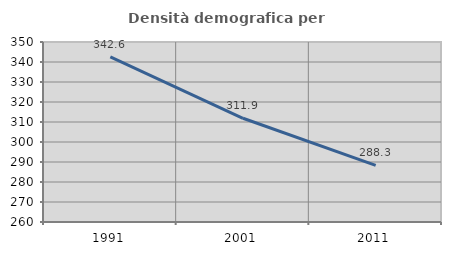
| Category | Densità demografica |
|---|---|
| 1991.0 | 342.571 |
| 2001.0 | 311.857 |
| 2011.0 | 288.319 |